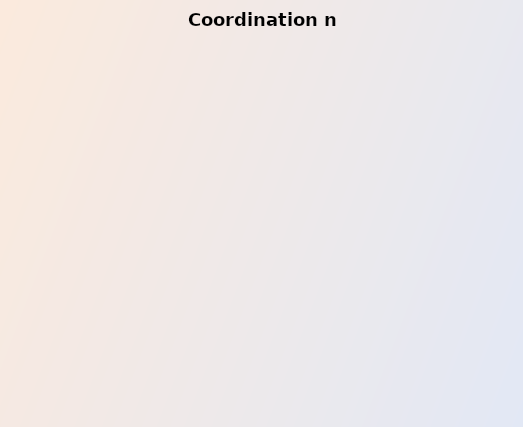
| Category | Series 0 |
|---|---|
| Coordination Platforms | 2 |
| Coordination Roles | 3 |
| Strategic Engagement and Support to Stakeholders | 5 |